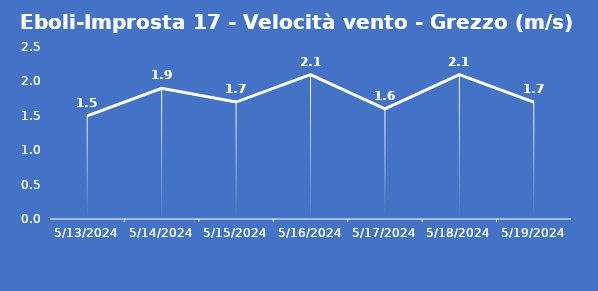
| Category | Eboli-Improsta 17 - Velocità vento - Grezzo (m/s) |
|---|---|
| 5/13/24 | 1.5 |
| 5/14/24 | 1.9 |
| 5/15/24 | 1.7 |
| 5/16/24 | 2.1 |
| 5/17/24 | 1.6 |
| 5/18/24 | 2.1 |
| 5/19/24 | 1.7 |